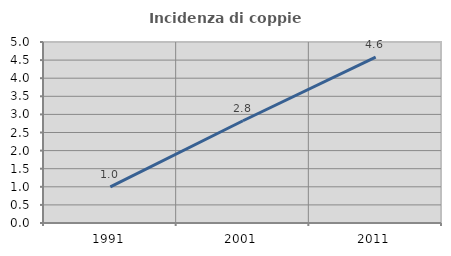
| Category | Incidenza di coppie miste |
|---|---|
| 1991.0 | 1 |
| 2001.0 | 2.825 |
| 2011.0 | 4.58 |